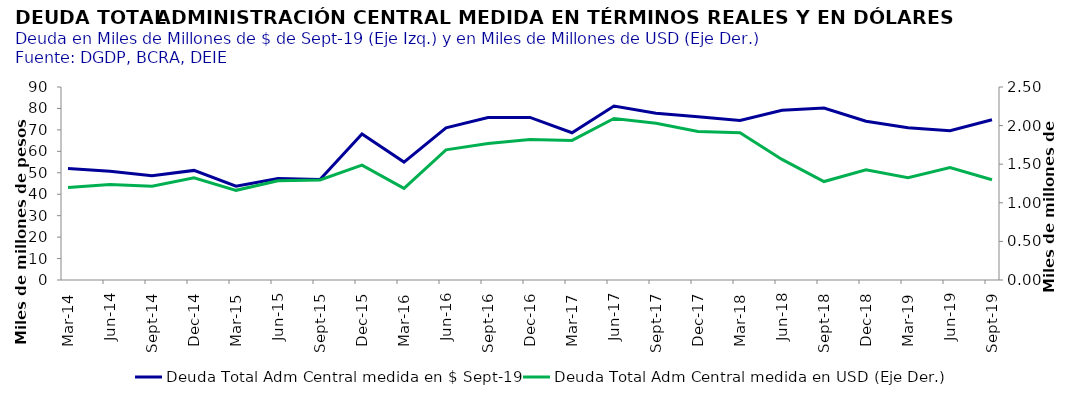
| Category | Deuda Total Adm Central medida en $ Sept-19 |
|---|---|
| 2014-03-31 | 52041214582.004 |
| 2014-06-30 | 50756119817.805 |
| 2014-09-30 | 48569513491.254 |
| 2014-12-31 | 51104212033.849 |
| 2015-03-31 | 43756412254.705 |
| 2015-06-30 | 47335404387.448 |
| 2015-09-30 | 46824889335.958 |
| 2015-12-31 | 68075683564.94 |
| 2016-03-31 | 55004777488.092 |
| 2016-06-30 | 70943369407.091 |
| 2016-09-30 | 75809773204.825 |
| 2016-12-31 | 75829275182.949 |
| 2017-03-31 | 68655837870.964 |
| 2017-06-30 | 81128869179.159 |
| 2017-09-30 | 77793341498.366 |
| 2017-12-31 | 76156759225.933 |
| 2018-03-31 | 74425635926.337 |
| 2018-06-30 | 79188606960.319 |
| 2018-09-30 | 80172469760.965 |
| 2018-12-31 | 74031017766.239 |
| 2019-03-31 | 70965149524.138 |
| 2019-06-30 | 69635542067.191 |
| 2019-09-30 | 74754609257.101 |